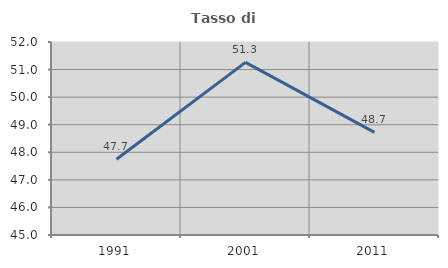
| Category | Tasso di occupazione   |
|---|---|
| 1991.0 | 47.75 |
| 2001.0 | 51.262 |
| 2011.0 | 48.721 |